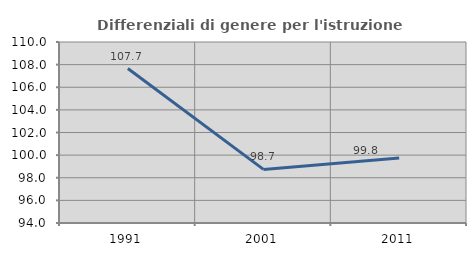
| Category | Differenziali di genere per l'istruzione superiore |
|---|---|
| 1991.0 | 107.655 |
| 2001.0 | 98.739 |
| 2011.0 | 99.753 |